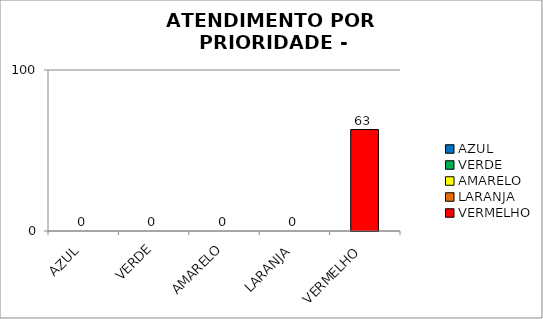
| Category | Total Regional: |
|---|---|
| AZUL | 0 |
| VERDE | 0 |
| AMARELO | 0 |
| LARANJA | 0 |
| VERMELHO | 63 |